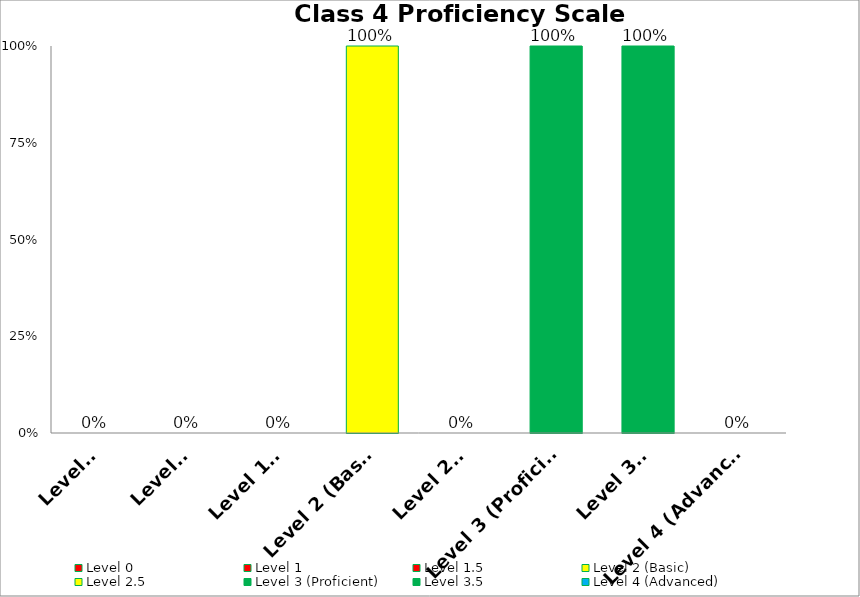
| Category | Series 0 |
|---|---|
| Level 0 | 0 |
| Level 1 | 0 |
| Level 1.5 | 0 |
| Level 2 (Basic) | 1 |
| Level 2.5 | 0 |
| Level 3 (Proficient) | 1 |
| Level 3.5 | 1 |
| Level 4 (Advanced) | 0 |